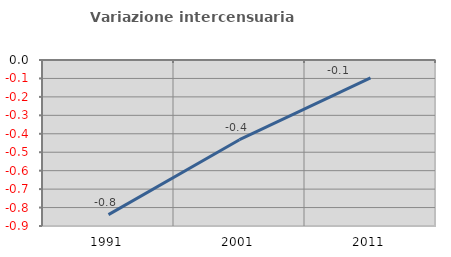
| Category | Variazione intercensuaria annua |
|---|---|
| 1991.0 | -0.838 |
| 2001.0 | -0.432 |
| 2011.0 | -0.097 |